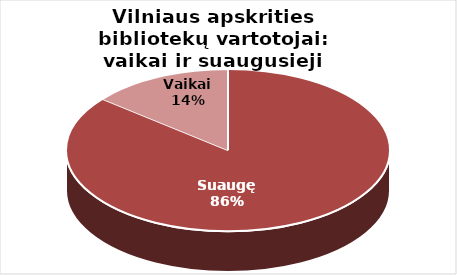
| Category | Series 0 |
|---|---|
| Suaugę | 78524 |
| Vaikai | 12907 |